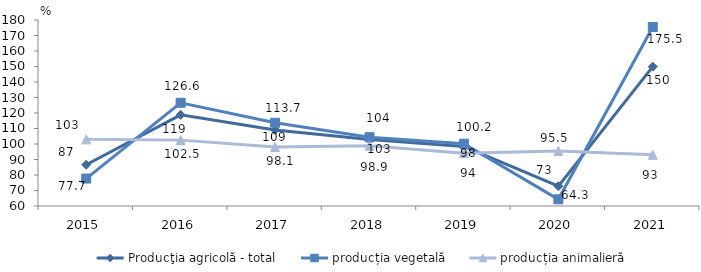
| Category | Producţia agricolă - total | producția vegetală | producția animalieră |
|---|---|---|---|
| 2015.0 | 86.6 | 77.7 | 103 |
| 2016.0 | 118.8 | 126.6 | 102.5 |
| 2017.0 | 109.1 | 113.7 | 98.1 |
| 2018.0 | 102.9 | 104.4 | 98.9 |
| 2019.0 | 98.4 | 100.2 | 94 |
| 2020.0 | 72.8 | 64.3 | 95.5 |
| 2021.0 | 149.9 | 175.5 | 93 |